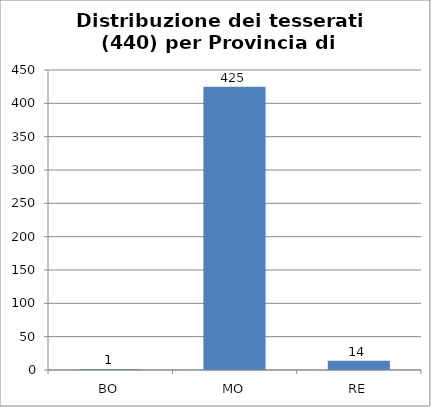
| Category | Nr. Tesserati |
|---|---|
| BO | 1 |
| MO | 425 |
| RE | 14 |